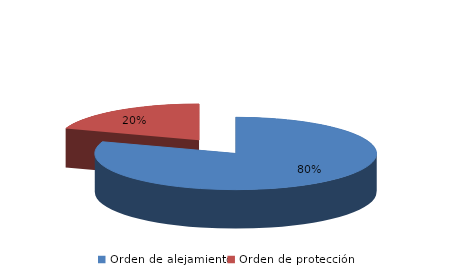
| Category | Series 0 |
|---|---|
| Orden de alejamiento | 134 |
| Orden de protección | 33 |